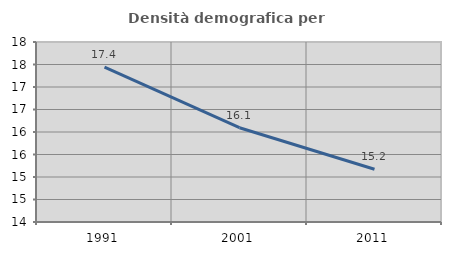
| Category | Densità demografica |
|---|---|
| 1991.0 | 17.443 |
| 2001.0 | 16.095 |
| 2011.0 | 15.172 |